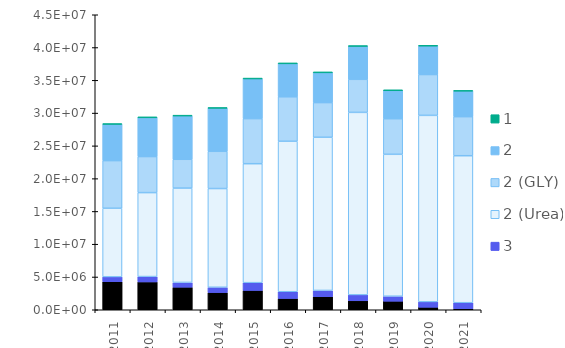
| Category | 4 | 3 | 2 (Urea) | 2 (GLY) | 2 | 1 |
|---|---|---|---|---|---|---|
| 2011.0 | 4271344.64 | 743816.64 | 10469945.6 | 7265055.52 | 5579486.96 | 577.44 |
| 2012.0 | 4245022.08 | 819479.04 | 12805160 | 5499876.64 | 5981841.84 | 875.28 |
| 2013.0 | 3441488 | 728450.88 | 14388280 | 4396080.24 | 6655533.28 | 1326.93 |
| 2014.0 | 2628815.36 | 801235.52 | 15059417.44 | 5681974.88 | 6609342.96 | 1278.29 |
| 2015.0 | 2948533.12 | 1182148.8 | 18148877.6 | 6874059.28 | 6113984.64 | 1335.64 |
| 2016.0 | 1722598.4 | 1026591.84 | 22951969.04 | 6781988.8 | 5097739.84 | 1884.17 |
| 2017.0 | 1992417.28 | 954377.6 | 23366133.52 | 5289346 | 4608016.64 | 1650.43 |
| 2018.0 | 1368591.36 | 902622.56 | 27838859.2 | 5042019.52 | 5071690 | 2291.43 |
| 2019.0 | 1304425.6 | 761413.76 | 21648280 | 5427227.68 | 4336086.08 | 1648.34 |
| 2020.0 | 382579.84 | 824854.24 | 28447751.84 | 6226027.52 | 4385349.6 | 2806.12 |
| 2021.0 | 169666.56 | 903166.4 | 22421490.24 | 5960263.68 | 3934955.84 | 3321.28 |